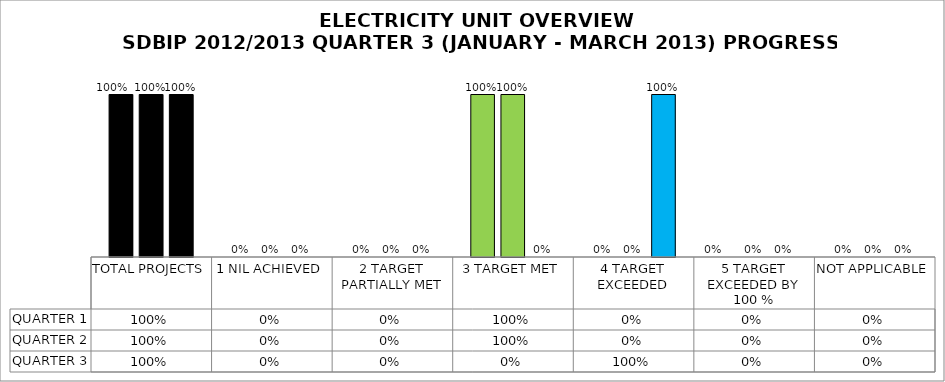
| Category | QUARTER 1 | QUARTER 2 | QUARTER 3 |
|---|---|---|---|
| TOTAL PROJECTS | 1 | 1 | 1 |
| 1 NIL ACHIEVED | 0 | 0 | 0 |
| 2 TARGET PARTIALLY MET | 0 | 0 | 0 |
| 3 TARGET MET | 1 | 1 | 0 |
| 4 TARGET EXCEEDED | 0 | 0 | 1 |
| 5 TARGET EXCEEDED BY 100 % | 0 | 0 | 0 |
| NOT APPLICABLE | 0 | 0 | 0 |